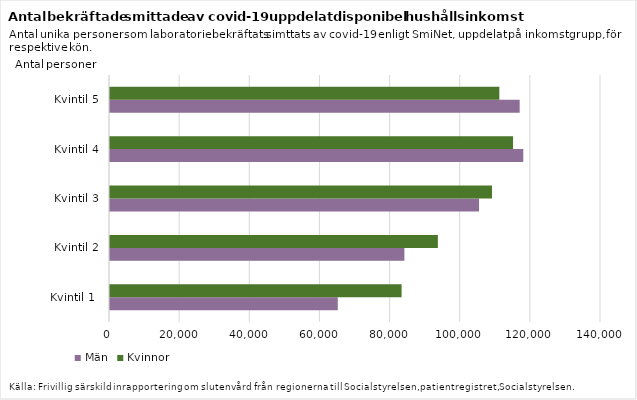
| Category | Män | Kvinnor |
|---|---|---|
| Kvintil 1  | 64947 | 83144 |
| Kvintil 2 | 83940 | 93489 |
| Kvintil 3 | 105225 | 108916 |
| Kvintil 4 | 117844 | 114927 |
| Kvintil 5 | 116808 | 111012 |